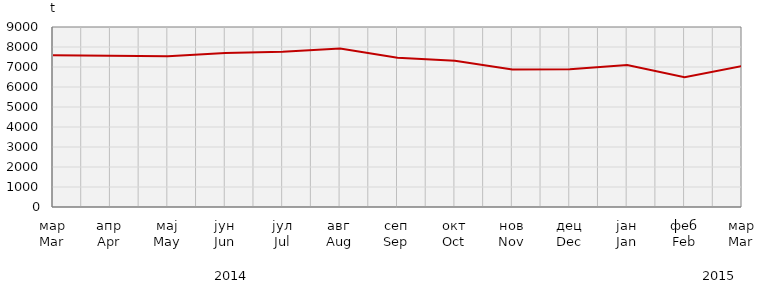
| Category | Прикупљање крављег млијека
Collecting of cow’s milk |
|---|---|
| мар
Mar | 7591.3 |
| апр
Apr | 7558.844 |
| мај
May | 7539.71 |
| јун
Jun | 7705.273 |
| јул
Jul | 7759.37 |
| авг
Aug | 7925.8 |
| сеп
Sep | 7457.865 |
| окт
Oct | 7318.004 |
| нов
Nov | 6875.135 |
| дец
Dec | 6887.315 |
| јан
Jan | 7099.8 |
| феб
Feb | 6490.829 |
| мар
Mar | 7044.938 |